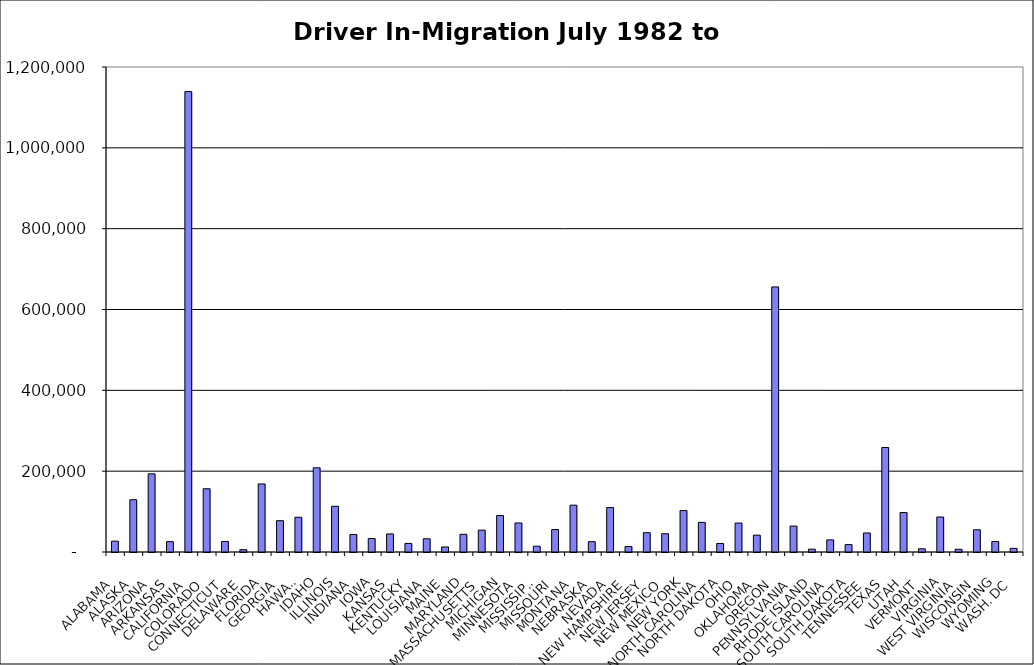
| Category | Series 0 |
|---|---|
| ALABAMA | 26814.5 |
| ALASKA | 129287.5 |
| ARIZONA | 193388 |
| ARKANSAS | 25608.5 |
| CALIFORNIA | 1139183.5 |
| COLORADO | 156478 |
| CONNECTICUT | 26048 |
| DELAWARE | 5731.5 |
| FLORIDA | 168404 |
| GEORGIA | 77489 |
| HAWAII | 86009.5 |
| IDAHO | 208325.5 |
| ILLINOIS | 113125.5 |
| INDIANA | 43224 |
| IOWA | 33307.5 |
| KANSAS | 44644.5 |
| KENTUCKY | 21206 |
| LOUISIANA | 32734.5 |
| MAINE | 12424.5 |
| MARYLAND | 43814 |
| MASSACHUSETTS | 54089 |
| MICHIGAN | 90308 |
| MINNESOTA | 71814.5 |
| MISSISSIPPI | 14306 |
| MISSOURI | 55555 |
| MONTANA | 115882 |
| NEBRASKA | 25627.5 |
| NEVADA | 109959 |
| NEW HAMPSHIRE | 13431.5 |
| NEW JERSEY | 47779 |
| NEW MEXICO | 45187 |
| NEW YORK | 102516 |
| NORTH CAROLINA | 73251.5 |
| NORTH DAKOTA | 21096.5 |
| OHIO | 71652.5 |
| OKLAHOMA | 41652 |
| OREGON | 655902 |
| PENNSYLVANIA | 64171.5 |
| RHODE ISLAND | 7092 |
| SOUTH CAROLINA | 29972.5 |
| SOUTH DAKOTA | 18258.5 |
| TENNESSEE | 47081.5 |
| TEXAS | 258491 |
| UTAH | 97605.5 |
| VERMONT | 7925 |
| VIRGINIA | 86611 |
| WEST VIRGINIA | 6705.5 |
| WISCONSIN | 54987.5 |
| WYOMING | 26035 |
| WASH. DC | 8972 |